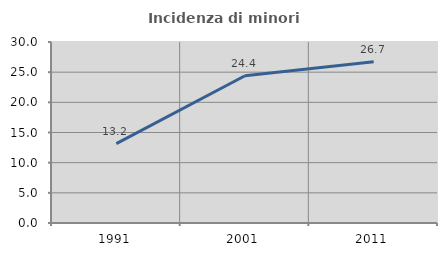
| Category | Incidenza di minori stranieri |
|---|---|
| 1991.0 | 13.158 |
| 2001.0 | 24.409 |
| 2011.0 | 26.738 |